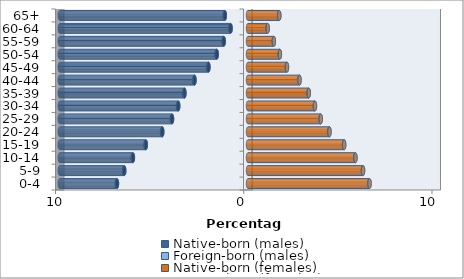
| Category | Native-born (males) | Foreign-born (males) | Native-born (females) | Foreign-born (females) |
|---|---|---|---|---|
| 0-4 | -6.96 | -0.013 | 6.45 | 0.011 |
| 5-9 | -6.575 | -0.013 | 6.105 | 0.011 |
| 10-14 | -6.114 | -0.014 | 5.701 | 0.011 |
| 15-19 | -5.429 | -0.014 | 5.102 | 0.01 |
| 20-24 | -4.554 | -0.016 | 4.321 | 0.01 |
| 25-29 | -4.036 | -0.018 | 3.857 | 0.01 |
| 30-34 | -3.706 | -0.021 | 3.55 | 0.011 |
| 35-39 | -3.376 | -0.022 | 3.22 | 0.011 |
| 40-44 | -2.841 | -0.022 | 2.729 | 0.011 |
| 45-49 | -2.101 | -0.02 | 2.065 | 0.01 |
| 50-54 | -1.659 | -0.017 | 1.687 | 0.008 |
| 55-59 | -1.288 | -0.013 | 1.369 | 0.006 |
| 60-64 | -0.925 | -0.009 | 1.042 | 0.004 |
| 65+ | -1.231 | -0.006 | 1.659 | 0.003 |